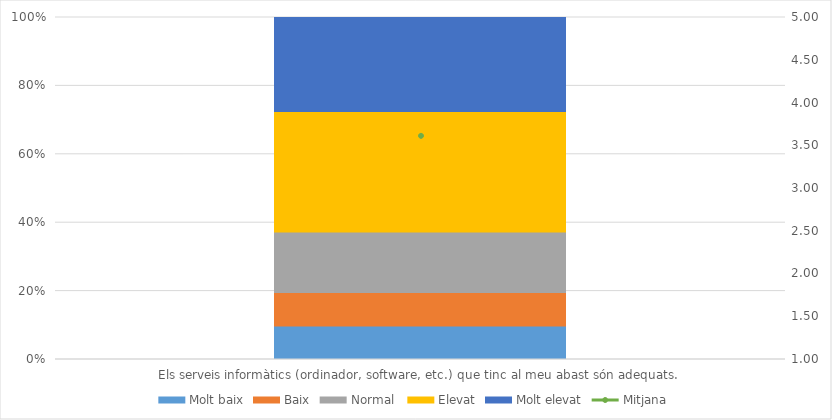
| Category | Molt baix | Baix | Normal  | Elevat | Molt elevat |
|---|---|---|---|---|---|
| Els serveis informàtics (ordinador, software, etc.) que tinc al meu abast són adequats. | 10 | 10 | 18 | 36 | 28 |